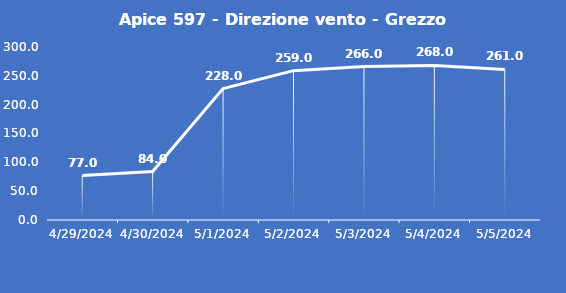
| Category | Apice 597 - Direzione vento - Grezzo (°N) |
|---|---|
| 4/29/24 | 77 |
| 4/30/24 | 84 |
| 5/1/24 | 228 |
| 5/2/24 | 259 |
| 5/3/24 | 266 |
| 5/4/24 | 268 |
| 5/5/24 | 261 |